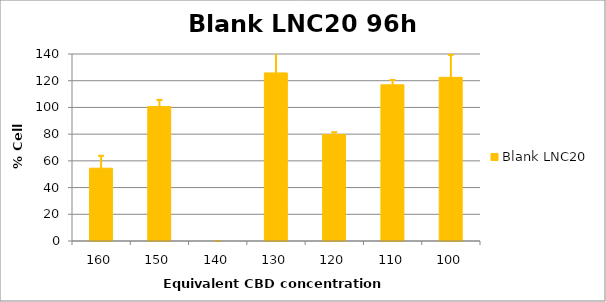
| Category | Blank LNC20 |
|---|---|
| 160.0 | 54.491 |
| 150.0 | 100.654 |
| 140.0 | 0 |
| 130.0 | 125.837 |
| 120.0 | 79.676 |
| 110.0 | 116.935 |
| 100.0 | 122.543 |